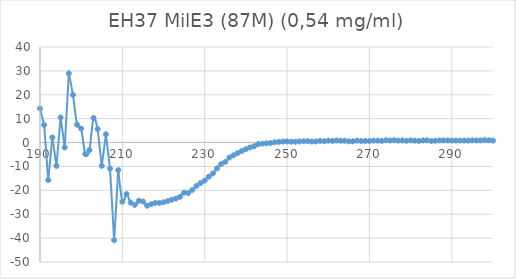
| Category | Series 0 |
|---|---|
| 300.0 | 0.824 |
| 299.0 | 0.942 |
| 298.0 | 1.028 |
| 297.0 | 0.901 |
| 296.0 | 0.882 |
| 295.0 | 0.947 |
| 294.0 | 0.813 |
| 293.0 | 0.852 |
| 292.0 | 0.808 |
| 291.0 | 0.815 |
| 290.0 | 0.827 |
| 289.0 | 0.891 |
| 288.0 | 0.892 |
| 287.0 | 0.876 |
| 286.0 | 0.746 |
| 285.0 | 0.643 |
| 284.0 | 0.941 |
| 283.0 | 0.883 |
| 282.0 | 0.679 |
| 281.0 | 0.793 |
| 280.0 | 0.9 |
| 279.0 | 0.733 |
| 278.0 | 0.872 |
| 277.0 | 0.823 |
| 276.0 | 0.967 |
| 275.0 | 0.845 |
| 274.0 | 0.985 |
| 273.0 | 0.665 |
| 272.0 | 0.808 |
| 271.0 | 0.821 |
| 270.0 | 0.679 |
| 269.0 | 0.675 |
| 268.0 | 0.636 |
| 267.0 | 0.813 |
| 266.0 | 0.525 |
| 265.0 | 0.496 |
| 264.0 | 0.774 |
| 263.0 | 0.753 |
| 262.0 | 0.858 |
| 261.0 | 0.67 |
| 260.0 | 0.794 |
| 259.0 | 0.54 |
| 258.0 | 0.675 |
| 257.0 | 0.443 |
| 256.0 | 0.419 |
| 255.0 | 0.597 |
| 254.0 | 0.552 |
| 253.0 | 0.47 |
| 252.0 | 0.331 |
| 251.0 | 0.369 |
| 250.0 | 0.49 |
| 249.0 | 0.41 |
| 248.0 | 0.281 |
| 247.0 | 0.152 |
| 246.0 | -0.185 |
| 245.0 | -0.335 |
| 244.0 | -0.443 |
| 243.0 | -0.62 |
| 242.0 | -1.557 |
| 241.0 | -2.046 |
| 240.0 | -2.769 |
| 239.0 | -3.524 |
| 238.0 | -4.413 |
| 237.0 | -5.339 |
| 236.0 | -6.26 |
| 235.0 | -8.073 |
| 234.0 | -8.98 |
| 233.0 | -10.778 |
| 232.0 | -12.951 |
| 231.0 | -14.294 |
| 230.0 | -15.896 |
| 229.0 | -16.913 |
| 228.0 | -18.128 |
| 227.0 | -19.82 |
| 226.0 | -21.115 |
| 225.0 | -20.973 |
| 224.0 | -22.696 |
| 223.0 | -23.451 |
| 222.0 | -23.928 |
| 221.0 | -24.488 |
| 220.0 | -25.003 |
| 219.0 | -25.272 |
| 218.0 | -25.239 |
| 217.0 | -25.839 |
| 216.0 | -26.444 |
| 215.0 | -24.662 |
| 214.0 | -24.349 |
| 213.0 | -26.083 |
| 212.0 | -25.141 |
| 211.0 | -21.563 |
| 210.0 | -24.764 |
| 209.0 | -11.524 |
| 208.0 | -40.841 |
| 207.0 | -10.93 |
| 206.0 | 3.47 |
| 205.0 | -9.751 |
| 204.0 | 5.666 |
| 203.0 | 10.331 |
| 202.0 | -3.168 |
| 201.0 | -4.799 |
| 200.0 | 5.807 |
| 199.0 | 7.495 |
| 198.0 | 19.922 |
| 197.0 | 28.932 |
| 196.0 | -2.063 |
| 195.0 | 10.503 |
| 194.0 | -9.786 |
| 193.0 | 2.15 |
| 192.0 | -15.703 |
| 191.0 | 7.357 |
| 190.0 | 14.27 |